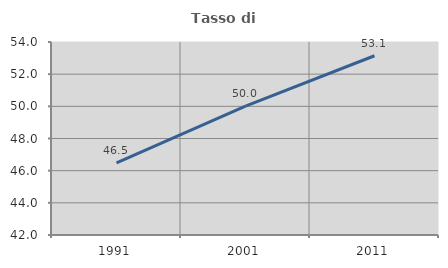
| Category | Tasso di occupazione   |
|---|---|
| 1991.0 | 46.484 |
| 2001.0 | 50.009 |
| 2011.0 | 53.145 |